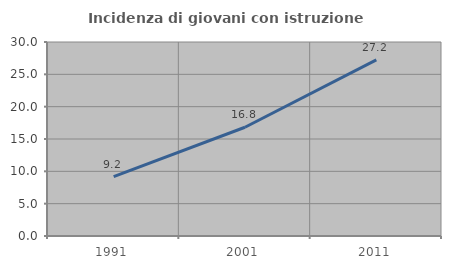
| Category | Incidenza di giovani con istruzione universitaria |
|---|---|
| 1991.0 | 9.179 |
| 2001.0 | 16.814 |
| 2011.0 | 27.225 |